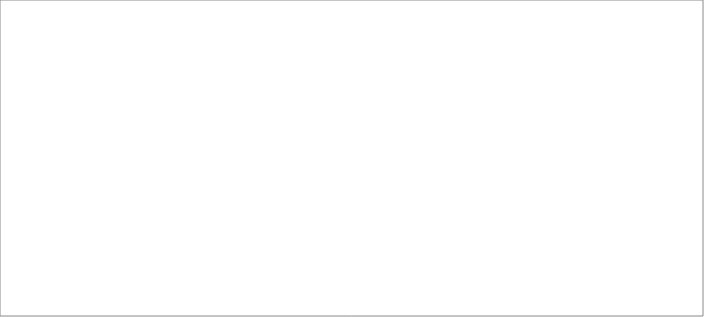
| Category | PreA | PostA |
|---|---|---|
| 0 | 1 | 1 |